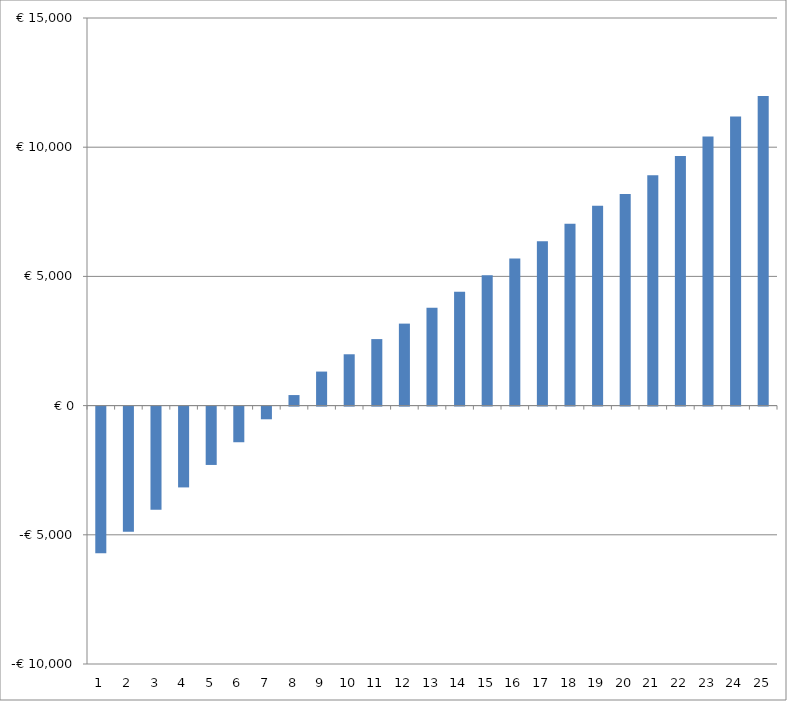
| Category | Series 0 |
|---|---|
| 0 | -5677.078 |
| 1 | -4839.617 |
| 2 | -3988.029 |
| 3 | -3127.554 |
| 4 | -2258.095 |
| 5 | -1379.303 |
| 6 | -490.817 |
| 7 | 407.736 |
| 8 | 1316.735 |
| 9 | 1986.575 |
| 10 | 2573.909 |
| 11 | 3172.904 |
| 12 | 3783.988 |
| 13 | 4407.6 |
| 14 | 5044.195 |
| 15 | 5694.239 |
| 16 | 6358.213 |
| 17 | 7036.611 |
| 18 | 7729.943 |
| 19 | 8188.731 |
| 20 | 8913.516 |
| 21 | 9654.853 |
| 22 | 10413.314 |
| 23 | 11189.488 |
| 24 | 11983.98 |